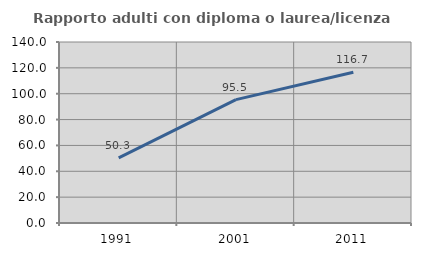
| Category | Rapporto adulti con diploma o laurea/licenza media  |
|---|---|
| 1991.0 | 50.307 |
| 2001.0 | 95.455 |
| 2011.0 | 116.667 |